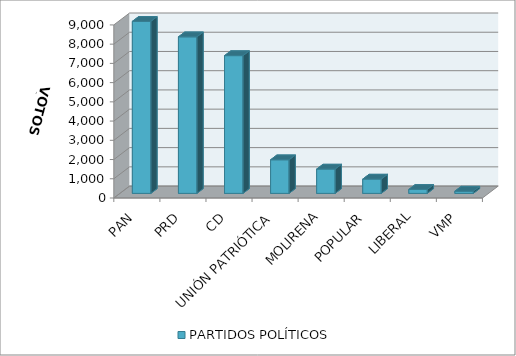
| Category | PARTIDOS POLÍTICOS |
|---|---|
| PAN | 8947 |
| PRD | 8141 |
| CD | 7163 |
| UNIÓN PATRIÓTICA | 1748 |
| MOLIRENA | 1264 |
| POPULAR | 743 |
| LIBERAL | 206 |
| VMP | 116 |